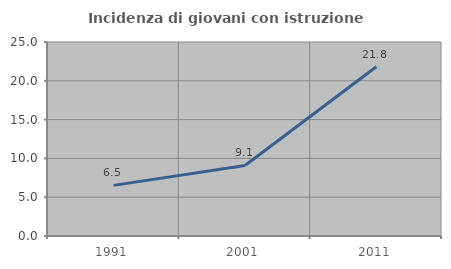
| Category | Incidenza di giovani con istruzione universitaria |
|---|---|
| 1991.0 | 6.522 |
| 2001.0 | 9.091 |
| 2011.0 | 21.813 |